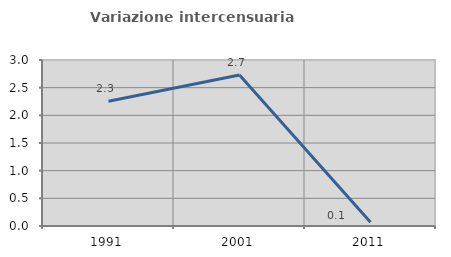
| Category | Variazione intercensuaria annua |
|---|---|
| 1991.0 | 2.255 |
| 2001.0 | 2.728 |
| 2011.0 | 0.066 |